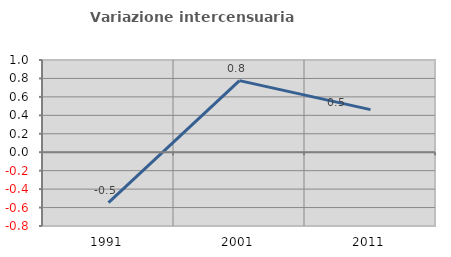
| Category | Variazione intercensuaria annua |
|---|---|
| 1991.0 | -0.546 |
| 2001.0 | 0.777 |
| 2011.0 | 0.462 |